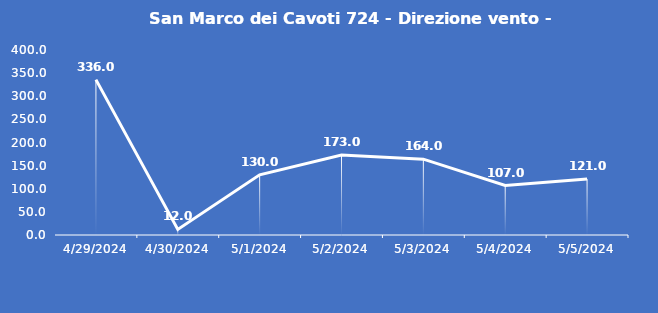
| Category | San Marco dei Cavoti 724 - Direzione vento - Grezzo (°N) |
|---|---|
| 4/29/24 | 336 |
| 4/30/24 | 12 |
| 5/1/24 | 130 |
| 5/2/24 | 173 |
| 5/3/24 | 164 |
| 5/4/24 | 107 |
| 5/5/24 | 121 |